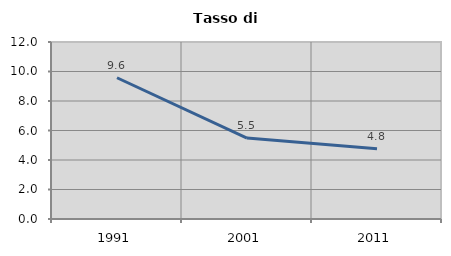
| Category | Tasso di disoccupazione   |
|---|---|
| 1991.0 | 9.576 |
| 2001.0 | 5.487 |
| 2011.0 | 4.77 |